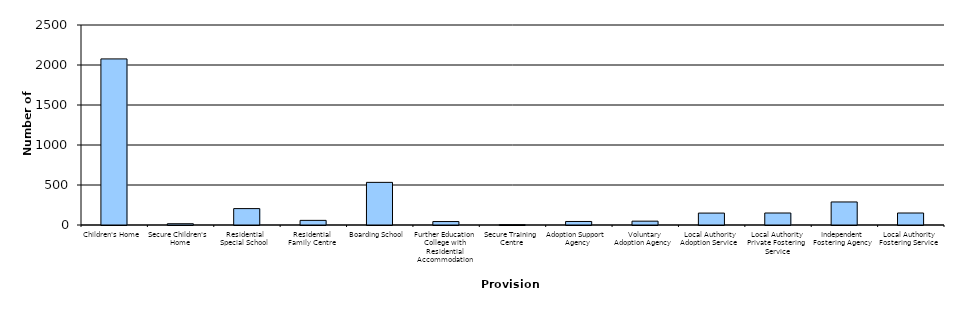
| Category | Series 0 |
|---|---|
| Children's Home | 2076 |
| Secure Children's Home | 16 |
| Residential Special School | 205 |
| Residential Family Centre | 58 |
| Boarding School | 533 |
| Further Education College with Residential Accommodation | 43 |
| Secure Training Centre | 4 |
| Adoption Support Agency | 44 |
| Voluntary Adoption Agency | 48 |
| Local Authority Adoption Service | 149 |
| Local Authority Private Fostering Service | 150 |
| Independent Fostering Agency | 288 |
| Local Authority Fostering Service | 150 |